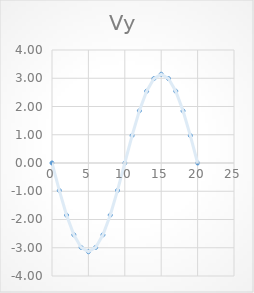
| Category | Series 0 |
|---|---|
| 0.0 | 0 |
| 1.0 | -0.971 |
| 2.0 | -1.847 |
| 3.0 | -2.542 |
| 4.0 | -2.988 |
| 5.0 | -3.142 |
| 6.0 | -2.988 |
| 7.0 | -2.542 |
| 8.0 | -1.847 |
| 9.0 | -0.971 |
| 10.0 | 0 |
| 11.0 | 0.971 |
| 12.0 | 1.847 |
| 13.0 | 2.542 |
| 14.0 | 2.988 |
| 15.0 | 3.142 |
| 16.0 | 2.988 |
| 17.0 | 2.542 |
| 18.0 | 1.847 |
| 19.0 | 0.971 |
| 20.0 | 0 |